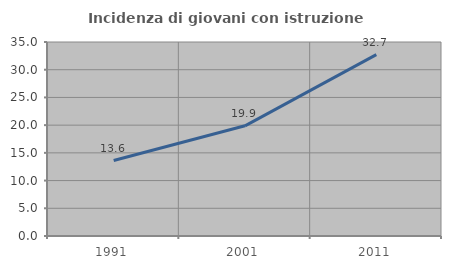
| Category | Incidenza di giovani con istruzione universitaria |
|---|---|
| 1991.0 | 13.62 |
| 2001.0 | 19.879 |
| 2011.0 | 32.72 |